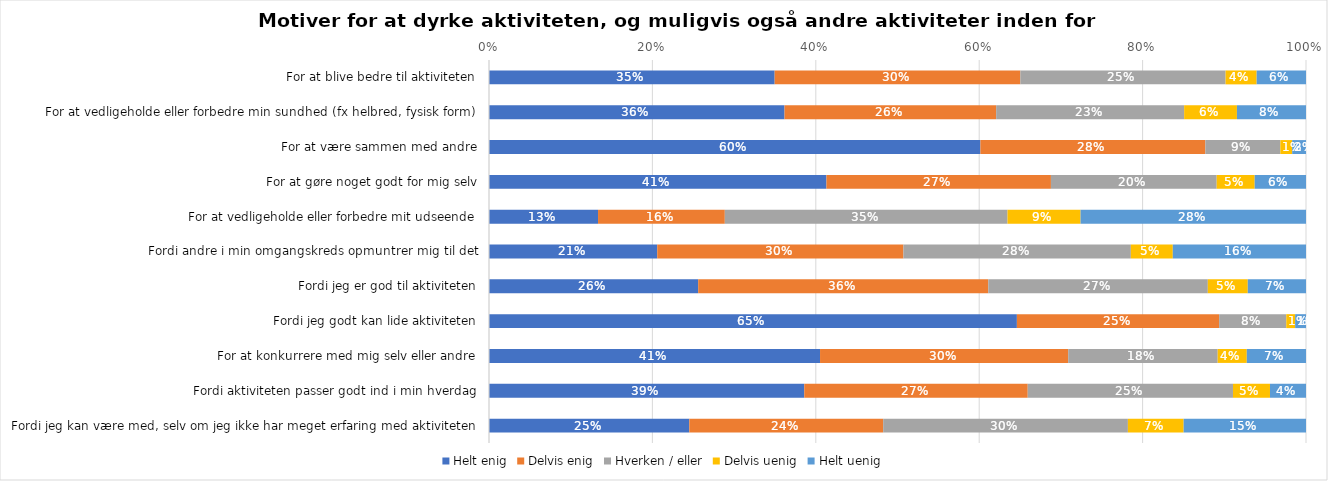
| Category | Helt enig | Delvis enig | Hverken / eller | Delvis uenig | Helt uenig |
|---|---|---|---|---|---|
| For at blive bedre til aktiviteten | 0.35 | 0.301 | 0.251 | 0.038 | 0.06 |
| For at vedligeholde eller forbedre min sundhed (fx helbred, fysisk form) | 0.362 | 0.259 | 0.23 | 0.065 | 0.085 |
| For at være sammen med andre | 0.601 | 0.275 | 0.092 | 0.014 | 0.017 |
| For at gøre noget godt for mig selv | 0.413 | 0.275 | 0.203 | 0.046 | 0.063 |
| For at vedligeholde eller forbedre mit udseende | 0.133 | 0.155 | 0.346 | 0.089 | 0.276 |
| Fordi andre i min omgangskreds opmuntrer mig til det | 0.206 | 0.301 | 0.278 | 0.051 | 0.163 |
| Fordi jeg er god til aktiviteten | 0.256 | 0.355 | 0.269 | 0.049 | 0.071 |
| Fordi jeg godt kan lide aktiviteten | 0.646 | 0.248 | 0.082 | 0.011 | 0.013 |
| For at konkurrere med mig selv eller andre | 0.405 | 0.304 | 0.183 | 0.036 | 0.072 |
| Fordi aktiviteten passer godt ind i min hverdag | 0.386 | 0.274 | 0.251 | 0.045 | 0.044 |
| Fordi jeg kan være med, selv om jeg ikke har meget erfaring med aktiviteten | 0.245 | 0.237 | 0.3 | 0.068 | 0.15 |